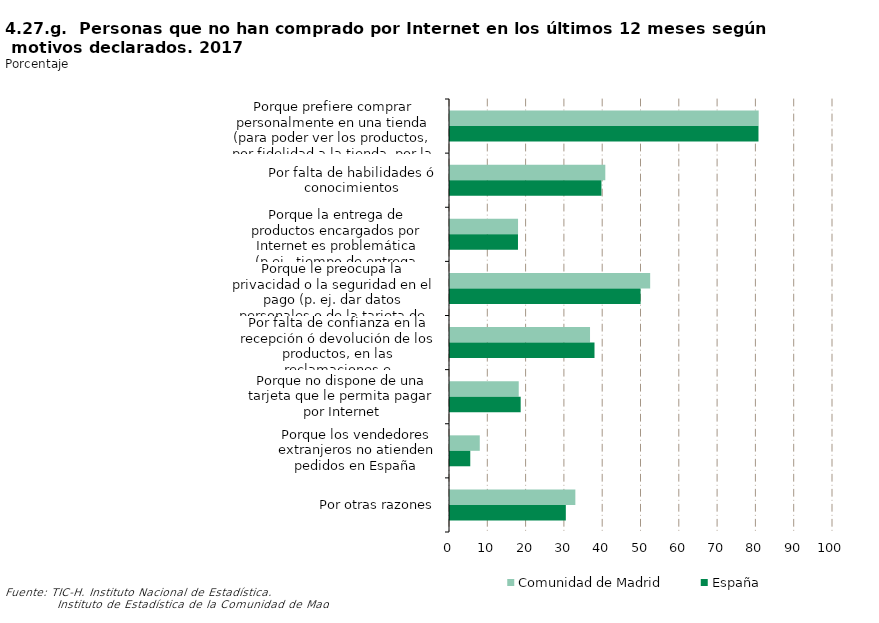
| Category | Comunidad de Madrid | España |
|---|---|---|
| Porque prefiere comprar personalmente en una tienda (para poder ver los productos, por fidelidad a la tienda, por la fuerza de la costumbre) | 80.6 | 80.543 |
| Por falta de habilidades ó conocimientos | 40.55 | 39.539 |
| Porque la entrega de productos encargados por Internet es problemática (p.ej., tiempo de entrega demasiado largo, distribución complicada, etc) | 17.766 | 17.749 |
| Porque le preocupa la privacidad o la seguridad en el pago (p. ej. dar datos personales o de la tarjeta de crédito a través de Internet) | 52.264 | 49.757 |
| Por falta de confianza en la recepción ó devolución de los productos, en las reclamaciones e indemnizaciones | 36.56 | 37.727 |
| Porque no dispone de una tarjeta que le permita pagar por Internet | 17.946 | 18.453 |
| Porque los vendedores extranjeros no atienden pedidos en España | 7.771 | 5.292 |
| Por otras razones | 32.727 | 30.243 |